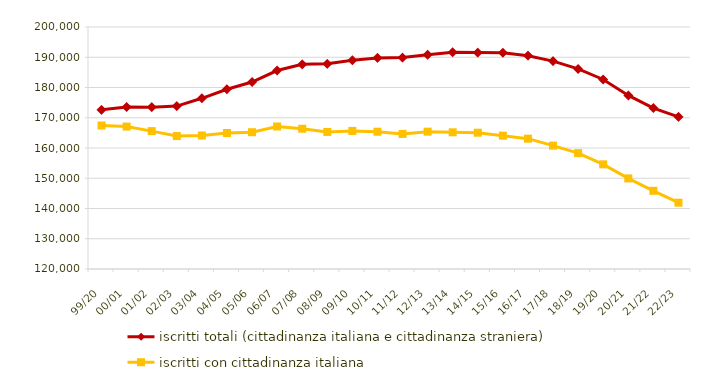
| Category | iscritti totali (cittadinanza italiana e cittadinanza straniera) | iscritti con cittadinanza italiana |
|---|---|---|
| 99/20 | 172629 | 167433 |
| 00/01 | 173560 | 167089 |
| 01/02 | 173506 | 165582 |
| 02/03 | 173854 | 163939 |
| 03/04 | 176434 | 164137 |
| 04/05 | 179413 | 164956 |
| 05/06 | 181806 | 165226 |
| 06/07 | 185610 | 167119 |
| 07/08 | 187671 | 166372 |
| 08/09 | 187828 | 165310 |
| 09/10 | 189007 | 165643 |
| 10/11 | 189769 | 165383 |
| 11/12 | 189898 | 164661 |
| 12/13 | 190849 | 165407 |
| 13/14 | 191642 | 165183 |
| 14/15 | 191547 | 165058 |
| 15/16 | 191459 | 164074 |
| 16/17 | 190511 | 163083 |
| 17/18 | 188722 | 160789 |
| 18/19 | 186144 | 158293 |
| 19/20 | 182651 | 154601 |
| 20/21 | 177368 | 149949 |
| 21/22 | 173208 | 145855 |
| 22/23 | 170277 | 141926 |